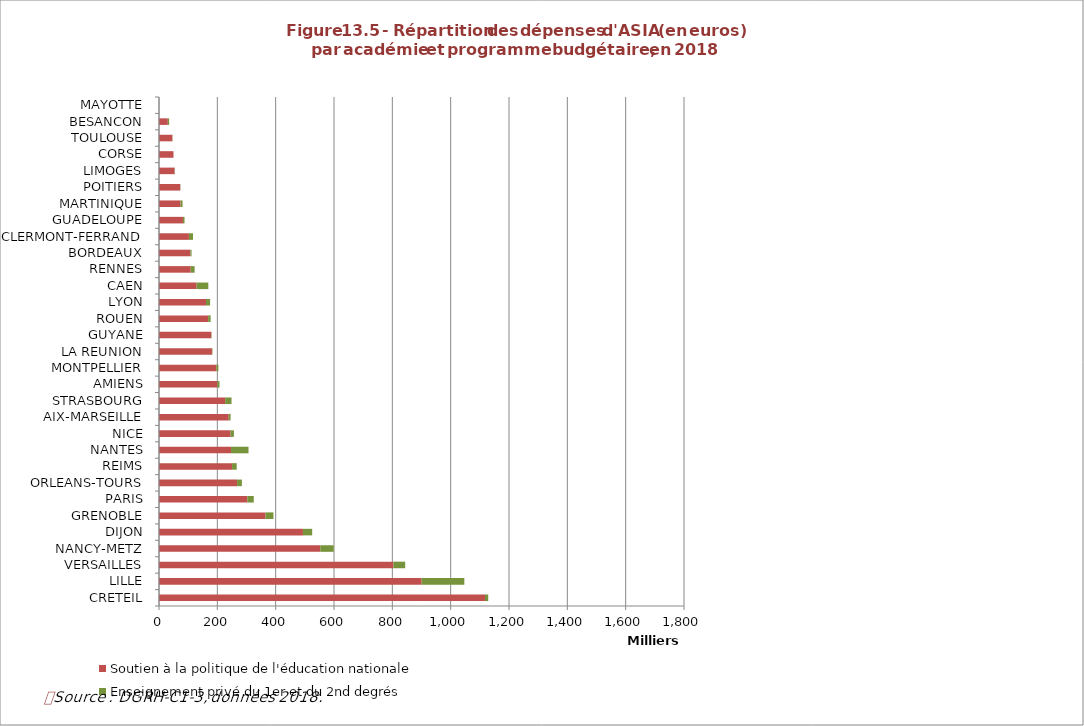
| Category | Soutien à la politique de l'éducation nationale | Enseignement privé du 1er et du 2nd degrés |
|---|---|---|
| CRETEIL | 1117778 | 11028 |
| LILLE | 900536 | 146329 |
| VERSAILLES | 803558 | 40468 |
| NANCY-METZ | 552863 | 46087 |
| DIJON | 493489 | 31699 |
| GRENOBLE | 365339 | 27038 |
| PARIS | 302664 | 22240 |
| ORLEANS-TOURS | 267604 | 16536 |
| REIMS | 250459 | 15974 |
| NANTES | 246954 | 59975 |
| NICE | 245427 | 11389 |
| AIX-MARSEILLE | 239112 | 6305 |
| STRASBOURG | 226766 | 21915 |
| AMIENS | 200122 | 7315 |
| MONTPELLIER | 196731 | 6942 |
| LA REUNION | 181634 | 1464 |
| GUYANE | 179109 | 1200 |
| ROUEN | 168441 | 8603 |
| LYON | 161242 | 13940 |
| CAEN | 129042 | 40058 |
| RENNES | 108683 | 13450 |
| BORDEAUX | 107642 | 3934 |
| CLERMONT-FERRAND | 102629 | 14006 |
| GUADELOUPE | 82073 | 5468 |
| MARTINIQUE | 73953 | 6746 |
| POITIERS | 72900 | 656 |
| LIMOGES | 53511 | 900 |
| CORSE | 49662 | 0 |
| TOULOUSE | 45858 | 570 |
| BESANCON | 30248 | 4480 |
| MAYOTTE | 0 | 0 |